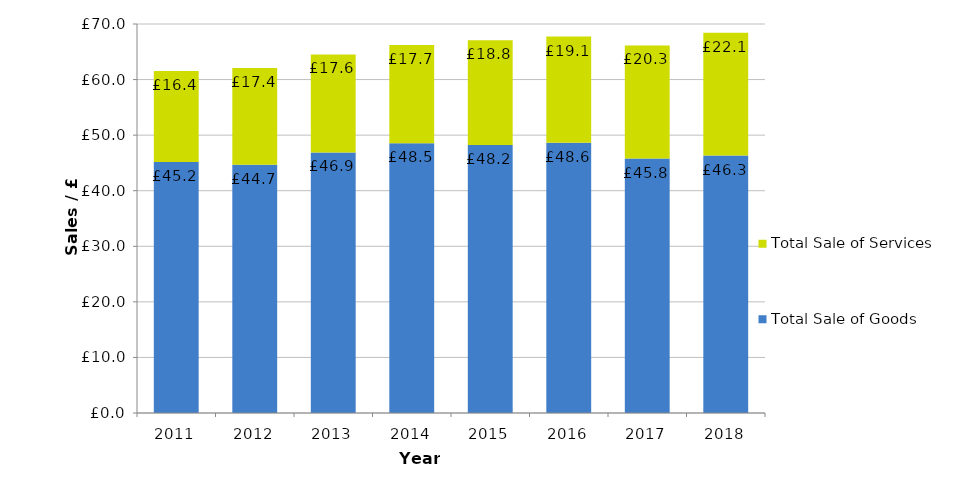
| Category | Total Sale of Goods | Total Sale of Services |
|---|---|---|
| 2011.0 | 45.168 | 16.361 |
| 2012.0 | 44.661 | 17.406 |
| 2013.0 | 46.885 | 17.628 |
| 2014.0 | 48.52 | 17.722 |
| 2015.0 | 48.241 | 18.844 |
| 2016.0 | 48.618 | 19.112 |
| 2017.0 | 45.792 | 20.349 |
| 2018.0 | 46.315 | 22.122 |